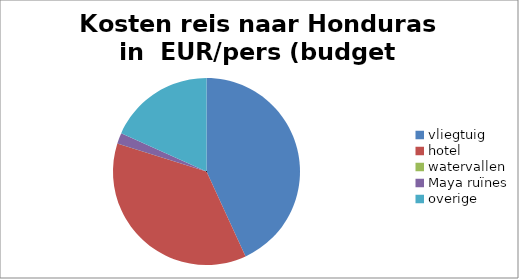
| Category | Kosten reis naar Honduras in  EUR/pers | Series 1 | Series 2 |
|---|---|---|---|
| vliegtuig | 472.22 |  |  |
| hotel | 402 |  |  |
| watervallen | 0 |  |  |
| Maya ruïnes | 20.46 |  |  |
| overige | 200 |  |  |